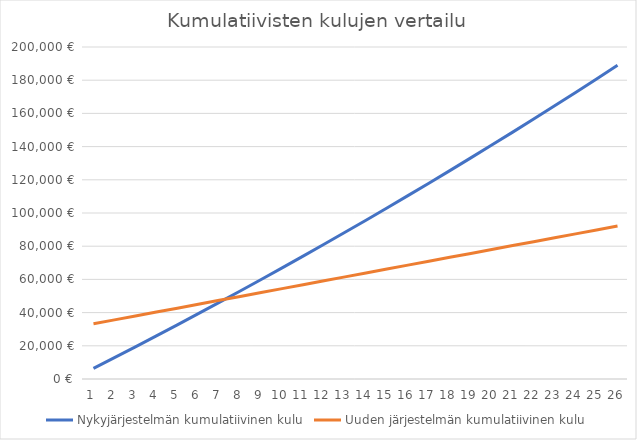
| Category | Nykyjärjestelmän kumulatiivinen kulu | Uuden järjestelmän kumulatiivinen kulu |
|---|---|---|
| 0 | 6400 | 33250 |
| 1 | 12864 | 35606 |
| 2 | 19392.64 | 37962 |
| 3 | 25986.566 | 40318 |
| 4 | 32646.432 | 42674 |
| 5 | 39372.896 | 45030 |
| 6 | 46166.625 | 47386 |
| 7 | 53028.292 | 49742 |
| 8 | 59958.575 | 52098 |
| 9 | 66958.16 | 54454 |
| 10 | 74027.742 | 56810 |
| 11 | 81168.019 | 59166 |
| 12 | 88379.699 | 61522 |
| 13 | 95663.496 | 63878 |
| 14 | 103020.131 | 66234 |
| 15 | 110450.333 | 68590 |
| 16 | 117954.836 | 70946 |
| 17 | 125534.384 | 73302 |
| 18 | 133189.728 | 75658 |
| 19 | 140921.626 | 78014 |
| 20 | 148730.842 | 80370 |
| 21 | 156618.15 | 82726 |
| 22 | 164584.332 | 85082 |
| 23 | 172630.175 | 87438 |
| 24 | 180756.477 | 89794 |
| 25 | 188964.042 | 92150 |